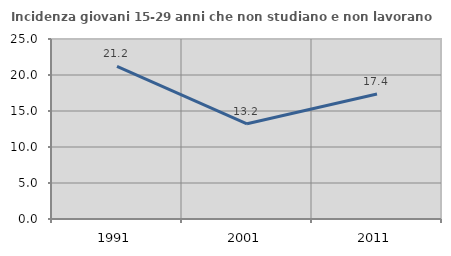
| Category | Incidenza giovani 15-29 anni che non studiano e non lavorano  |
|---|---|
| 1991.0 | 21.209 |
| 2001.0 | 13.227 |
| 2011.0 | 17.351 |